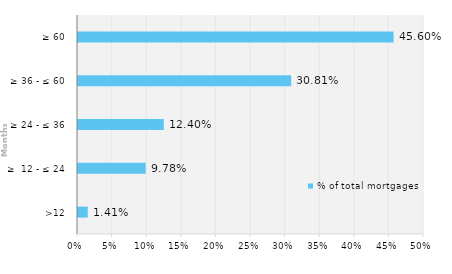
| Category | % of total mortgages |
|---|---|
| >12 | 0.014 |
| ≥  12 - ≤ 24 | 0.098 |
| ≥ 24 - ≤ 36 | 0.124 |
| ≥ 36 - ≤ 60 | 0.308 |
| ≥ 60 | 0.456 |